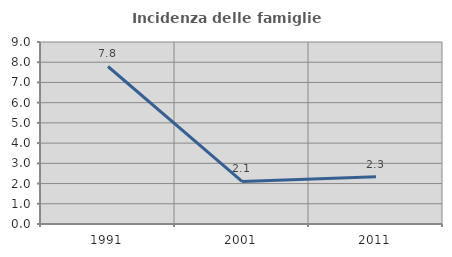
| Category | Incidenza delle famiglie numerose |
|---|---|
| 1991.0 | 7.789 |
| 2001.0 | 2.107 |
| 2011.0 | 2.339 |